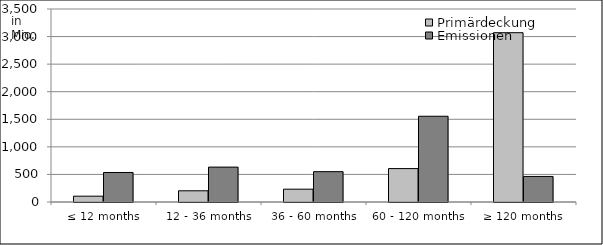
| Category | Primärdeckung | Emissionen |
|---|---|---|
| ≤ 12 months | 105415666.76 | 535000000 |
| 12 - 36 months | 203355804.751 | 632932113.52 |
| 36 - 60 months | 232419787.131 | 550150000 |
| 60 - 120 months | 606009903.66 | 1555000000 |
| ≥ 120 months | 3070167928.637 | 463435034.29 |